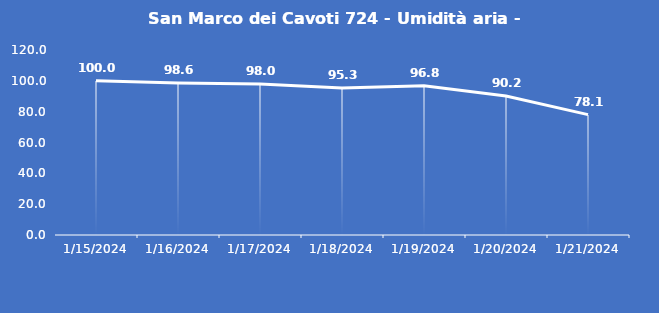
| Category | San Marco dei Cavoti 724 - Umidità aria - Grezzo (%) |
|---|---|
| 1/15/24 | 100 |
| 1/16/24 | 98.6 |
| 1/17/24 | 98 |
| 1/18/24 | 95.3 |
| 1/19/24 | 96.8 |
| 1/20/24 | 90.2 |
| 1/21/24 | 78.1 |